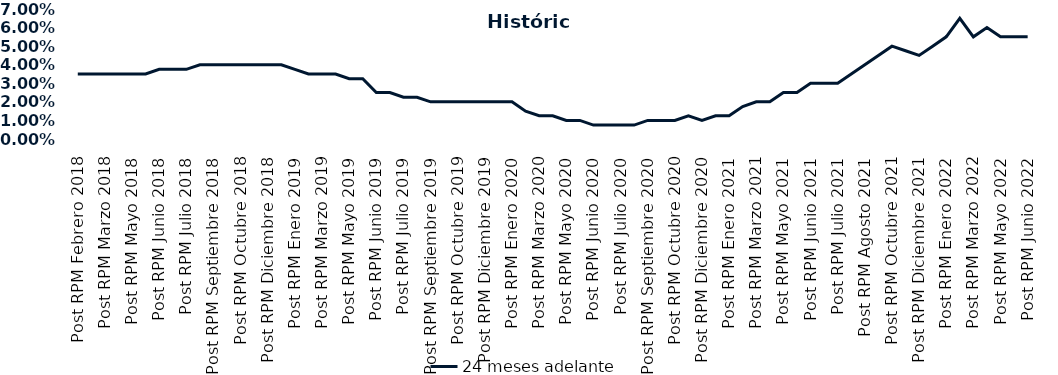
| Category | 24 meses adelante  |
|---|---|
| Post RPM Febrero 2018 | 0.035 |
| Pre RPM Marzo 2018 | 0.035 |
| Post RPM Marzo 2018 | 0.035 |
| Pre RPM Mayo 2018 | 0.035 |
| Post RPM Mayo 2018 | 0.035 |
| Pre RPM Junio 2018 | 0.035 |
| Post RPM Junio 2018 | 0.038 |
| Pre RPM Julio 2018 | 0.038 |
| Post RPM Julio 2018 | 0.038 |
| Pre RPM Septiembre 2018 | 0.04 |
| Post RPM Septiembre 2018 | 0.04 |
| Pre RPM Octubre 2018 | 0.04 |
| Post RPM Octubre 2018 | 0.04 |
| Pre RPM Diciembre 2018 | 0.04 |
| Post RPM Diciembre 2018 | 0.04 |
| Pre RPM Enero 2019 | 0.04 |
| Post RPM Enero 2019 | 0.038 |
| Pre RPM Marzo 2019 | 0.035 |
| Post RPM Marzo 2019 | 0.035 |
| Pre RPM Mayo 2019 | 0.035 |
| Post RPM Mayo 2019 | 0.032 |
| Pre RPM Junio 2019 | 0.032 |
| Post RPM Junio 2019 | 0.025 |
| Pre RPM Julio 2019 | 0.025 |
| Post RPM Julio 2019 | 0.022 |
| Pre RPM Septiembre 2019 | 0.022 |
| Post RPM Septiembre 2019 | 0.02 |
| Pre RPM Octubre 2019 | 0.02 |
| Post RPM Octubre 2019 | 0.02 |
| Pre RPM Diciembre 2019 | 0.02 |
| Post RPM Diciembre 2019 | 0.02 |
| Pre RPM Enero 2020 | 0.02 |
| Post RPM Enero 2020 | 0.02 |
| Pre RPM Marzo 2020 | 0.015 |
| Post RPM Marzo 2020 | 0.012 |
| Pre RPM Mayo 2020 | 0.012 |
| Post RPM Mayo 2020 | 0.01 |
| Pre RPM Junio 2020 | 0.01 |
| Post RPM Junio 2020 | 0.008 |
| Pre RPM Julio 2020 | 0.008 |
| Post RPM Julio 2020 | 0.008 |
| Pre RPM Septiembre 2020 | 0.008 |
| Post RPM Septiembre 2020 | 0.01 |
| Pre RPM Octubre 2020 | 0.01 |
| Post RPM Octubre 2020 | 0.01 |
| Pre RPM Diciembre 2020 | 0.012 |
| Post RPM Diciembre 2020 | 0.01 |
| Pre RPM Enero 2021 | 0.012 |
| Post RPM Enero 2021 | 0.012 |
| Pre RPM Marzo 2021 | 0.018 |
| Post RPM Marzo 2021 | 0.02 |
| Pre RPM Mayo 2021 | 0.02 |
| Post RPM Mayo 2021 | 0.025 |
| Pre RPM Junio 2021 | 0.025 |
| Post RPM Junio 2021 | 0.03 |
| Pre RPM Julio 2021 | 0.03 |
| Post RPM Julio 2021 | 0.03 |
| Pre RPM Agosto 2021 | 0.035 |
| Post RPM Agosto 2021 | 0.04 |
| Pre RPM Octubre 2021 | 0.045 |
| Post RPM Octubre 2021 | 0.05 |
| Pre RPM Diciembre 2021 | 0.048 |
| Post RPM Diciembre 2021 | 0.045 |
| Pre RPM Enero 2022 | 0.05 |
| Post RPM Enero 2022 | 0.055 |
| Pre RPM Marzo 2022 | 0.065 |
| Post RPM Marzo 2022 | 0.055 |
| Pre RPM Mayo 2022 | 0.06 |
| Post RPM Mayo 2022 | 0.055 |
| Pre RPM Junio 2022 | 0.055 |
| Post RPM Junio 2022 | 0.055 |